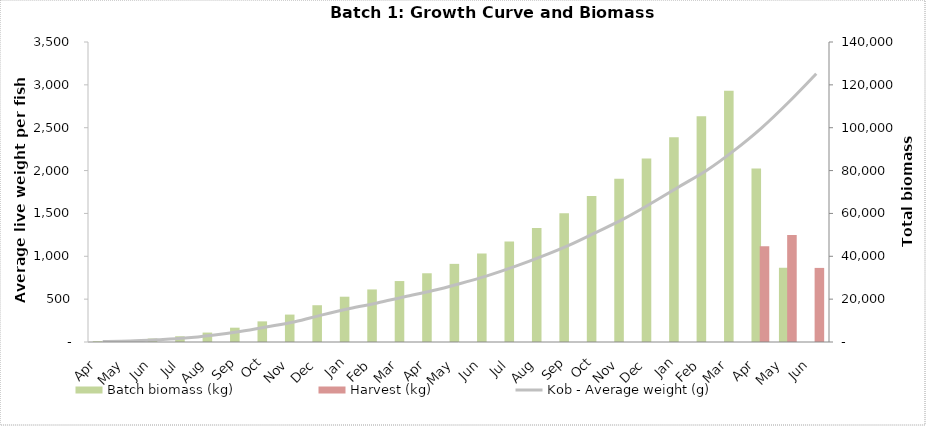
| Category | Batch biomass (kg) | Harvest (kg) |
|---|---|---|
| Apr | 342.932 | 0 |
| May | 748.479 | 0 |
| Jun | 1623.288 | 0 |
| Jul | 2672.361 | 0 |
| Aug | 4399.415 | 0 |
| Sep | 6675.75 | 0 |
| Oct | 9627.821 | 0 |
| Nov | 12792.2 | 0 |
| Dec | 17159.529 | 0 |
| Jan | 21134.061 | 0 |
| Feb | 24524.613 | 0 |
| Mar | 28444.941 | 0 |
| Apr | 32076.359 | 0 |
| May | 36462.202 | 0 |
| Jun | 41274.066 | 0 |
| Jul | 46918.507 | 0 |
| Aug | 53228.877 | 0 |
| Sep | 60138.768 | 0 |
| Oct | 68093.065 | 0 |
| Nov | 76237.445 | 0 |
| Dec | 85683.714 | 0 |
| Jan | 95589.25 | 0 |
| Feb | 105331.02 | 0 |
| Mar | 117303.902 | 0 |
| Apr | 80951.519 | 44651.105 |
| May | 34643.861 | 49912.525 |
| Jun | 0 | 34574.573 |